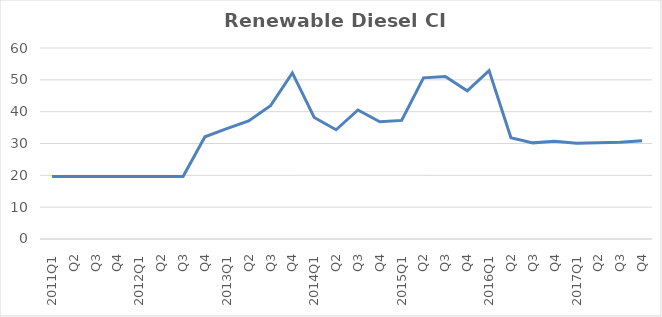
| Category | Renewable Diesel CI Avg |
|---|---|
| 2011Q1 | 19.65 |
| Q2 | 19.65 |
| Q3 | 19.65 |
| Q4 | 19.65 |
| 2012Q1 | 19.65 |
| Q2 | 19.65 |
| Q3 | 19.65 |
| Q4 | 32.11 |
| 2013Q1 | 34.65 |
| Q2 | 37.1 |
| Q3 | 41.86 |
| Q4 | 52.18 |
| 2014Q1 | 38.16 |
| Q2 | 34.32 |
| Q3 | 40.53 |
| Q4 | 36.84 |
| 2015Q1 | 37.26 |
| Q2 | 50.63 |
| Q3 | 51.06 |
| Q4 | 46.56 |
| 2016Q1 | 52.89 |
| Q2 | 31.78 |
| Q3 | 30.2 |
| Q4 | 30.71 |
| 2017Q1 | 30.11 |
| Q2 | 30.23 |
| Q3 | 30.39 |
| Q4 | 30.9 |